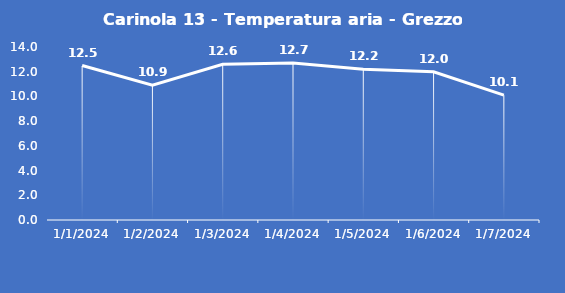
| Category | Carinola 13 - Temperatura aria - Grezzo (°C) |
|---|---|
| 1/1/24 | 12.5 |
| 1/2/24 | 10.9 |
| 1/3/24 | 12.6 |
| 1/4/24 | 12.7 |
| 1/5/24 | 12.2 |
| 1/6/24 | 12 |
| 1/7/24 | 10.1 |